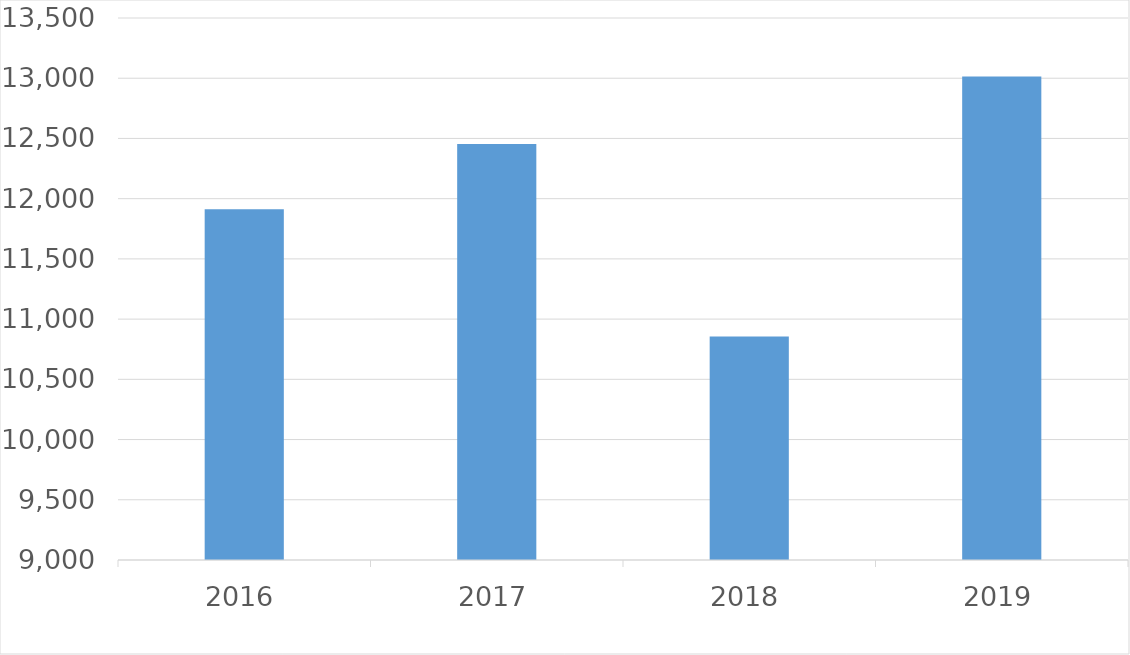
| Category | Series 0 |
|---|---|
| 2016 | 11913 |
| 2017 | 12454 |
| 2018 | 10856 |
| 2019 | 13014 |